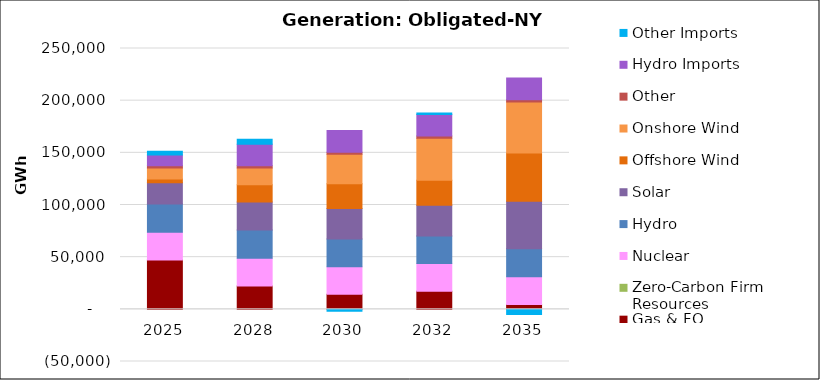
| Category | Gas & FO | Zero-Carbon Firm Resources | Nuclear | Hydro | Solar | Offshore Wind | Onshore Wind | Other | Hydro Imports | Other Imports |
|---|---|---|---|---|---|---|---|---|---|---|
| 2025.0 | 47219.31 | 0 | 26550.05 | 27187.09 | 20416.26 | 3560.16 | 10545.91 | 2085 | 10361.35 | 3612.76 |
| 2028.0 | 22465.73 | 0 | 26550.05 | 27016.77 | 26771.96 | 16567.84 | 16046.15 | 2085 | 20763.85 | 4750.6 |
| 2030.0 | 14363.89 | 0 | 26550.05 | 26380.49 | 29315.97 | 23788.54 | 28169.66 | 2085 | 20763.85 | -1912.01 |
| 2032.0 | 17268.15 | 0 | 26550.05 | 26472.73 | 29581.29 | 23788.54 | 40346.87 | 2085 | 20763.85 | 1246.54 |
| 2035.0 | 4605.56 | 0 | 26550.05 | 27022.62 | 45527.88 | 46081.71 | 49050.82 | 2085 | 20763.85 | -4899.19 |